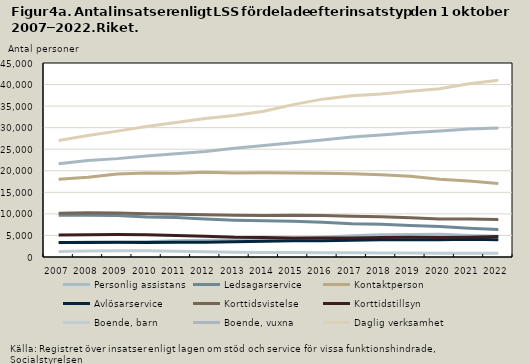
| Category | Personlig assistans | Ledsagarservice | Kontaktperson | Avlösarservice | Korttidsvistelse | Korttidstillsyn | Boende, barn | Boende, vuxna | Daglig verksamhet |
|---|---|---|---|---|---|---|---|---|---|
| 2007.0 | 3331 | 9665 | 18014 | 3377 | 10142 | 5112 | 1294 | 21632 | 27016 |
| 2008.0 | 3478 | 9673 | 18508 | 3359 | 10288 | 5189 | 1402 | 22390 | 28160 |
| 2009.0 | 3370 | 9653 | 19246 | 3407 | 10187 | 5220 | 1447 | 22818 | 29198 |
| 2010.0 | 3562 | 9290 | 19497 | 3391 | 10010 | 5166 | 1442 | 23428 | 30248 |
| 2011.0 | 3781 | 9176 | 19453 | 3402 | 9924 | 5016 | 1328 | 23948 | 31175 |
| 2012.0 | 3900 | 8796 | 19668 | 3445 | 9774 | 4799 | 1230 | 24464 | 32149 |
| 2013.0 | 3914 | 8548 | 19481 | 3536 | 9685 | 4559 | 1096 | 25216 | 32809 |
| 2014.0 | 4099 | 8427 | 19520 | 3647 | 9639 | 4502 | 1032 | 25846 | 33799 |
| 2015.0 | 4287 | 8302 | 19496 | 3764 | 9700 | 4383 | 1049 | 26495 | 35344 |
| 2016.0 | 4567 | 8045 | 19423 | 3797 | 9606 | 4427 | 987 | 27113 | 36615 |
| 2017.0 | 4915 | 7710 | 19308 | 3875 | 9449 | 4389 | 969 | 27847 | 37400 |
| 2018.0 | 5143 | 7569 | 19107 | 3989 | 9354 | 4495 | 942 | 28289 | 37832 |
| 2019.0 | 5218 | 7293 | 18722 | 3990 | 9132 | 4558 | 926 | 28827 | 38425 |
| 2020.0 | 5274 | 7055 | 18053 | 4013 | 8791 | 4502 | 879 | 29237 | 39024 |
| 2021.0 | 4982 | 6670 | 17624 | 4113 | 8842 | 4576 | 874 | 29671 | 40202 |
| 2022.0 | 4795 | 6394 | 17057 | 4002 | 8685 | 4772 | 849 | 29897 | 40988 |